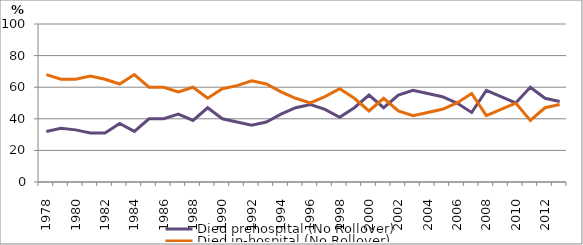
| Category | Died prehospital (No Rollover) | Died in-hospital (No Rollover) |
|---|---|---|
| 1978.0 | 32 | 68 |
| 1979.0 | 34 | 65 |
| 1980.0 | 33 | 65 |
| 1981.0 | 31 | 67 |
| 1982.0 | 31 | 65 |
| 1983.0 | 37 | 62 |
| 1984.0 | 32 | 68 |
| 1985.0 | 40 | 60 |
| 1986.0 | 40 | 60 |
| 1987.0 | 43 | 57 |
| 1988.0 | 39 | 60 |
| 1989.0 | 47 | 53 |
| 1990.0 | 40 | 59 |
| 1991.0 | 38 | 61 |
| 1992.0 | 36 | 64 |
| 1993.0 | 38 | 62 |
| 1994.0 | 43 | 57 |
| 1995.0 | 47 | 53 |
| 1996.0 | 49 | 50 |
| 1997.0 | 46 | 54 |
| 1998.0 | 41 | 59 |
| 1999.0 | 47 | 53 |
| 2000.0 | 55 | 45 |
| 2001.0 | 47 | 53 |
| 2002.0 | 55 | 45 |
| 2003.0 | 58 | 42 |
| 2004.0 | 56 | 44 |
| 2005.0 | 54 | 46 |
| 2006.0 | 50 | 50 |
| 2007.0 | 44 | 56 |
| 2008.0 | 58 | 42 |
| 2009.0 | 54 | 46 |
| 2010.0 | 50 | 50 |
| 2011.0 | 60 | 39 |
| 2012.0 | 53 | 47 |
| 2013.0 | 51 | 49 |